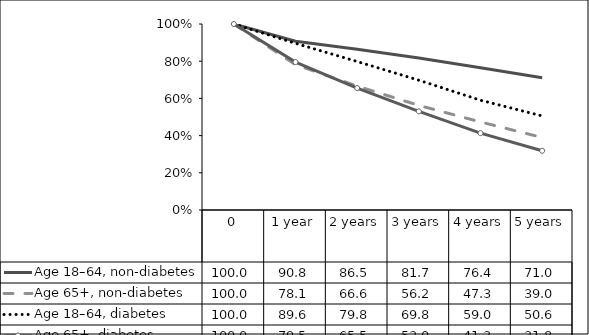
| Category | Age 18–64, non-diabetes | Age 65+, non-diabetes | Age 18–64, diabetes | Age 65+, diabetes |
|---|---|---|---|---|
| 0 | 100 | 100 | 100 | 100 |
| 1 year | 90.773 | 78.146 | 89.611 | 79.535 |
| 2 years | 86.458 | 66.6 | 79.825 | 65.55 |
| 3 years | 81.663 | 56.246 | 69.772 | 53.012 |
| 4 years | 76.429 | 47.334 | 59.019 | 41.342 |
| 5 years | 71.046 | 38.977 | 50.572 | 31.841 |